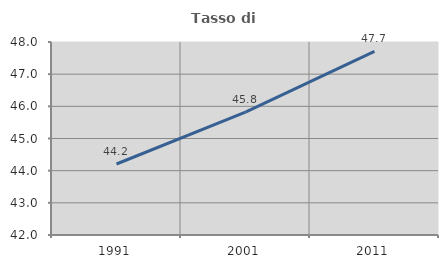
| Category | Tasso di occupazione   |
|---|---|
| 1991.0 | 44.208 |
| 2001.0 | 45.817 |
| 2011.0 | 47.708 |